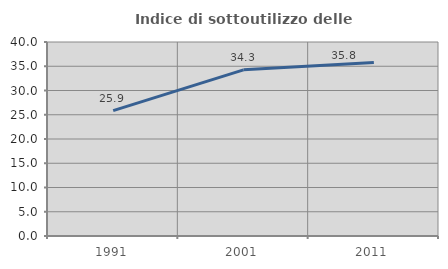
| Category | Indice di sottoutilizzo delle abitazioni  |
|---|---|
| 1991.0 | 25.862 |
| 2001.0 | 34.259 |
| 2011.0 | 35.789 |